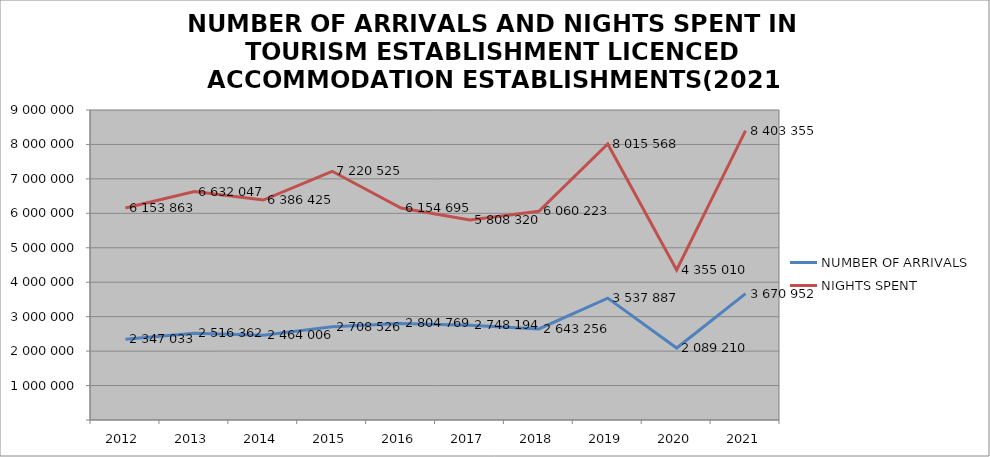
| Category | NUMBER OF ARRIVALS | NIGHTS SPENT |
|---|---|---|
| 2012 | 2347033 | 6153863 |
| 2013 | 2516362 | 6632047 |
| 2014 | 2464006 | 6386425 |
| 2015 | 2708526 | 7220525 |
| 2016 | 2804769 | 6154695 |
| 2017 | 2748194 | 5808320 |
| 2018 | 2643256 | 6060223 |
| 2019 | 3537887 | 8015568 |
| 2020 | 2089210 | 4355010 |
| 2021 | 3670952 | 8403355 |